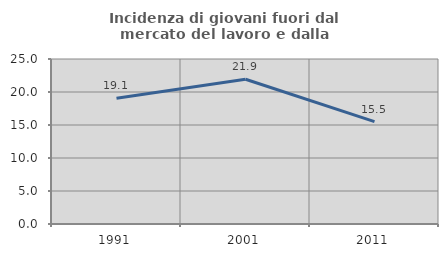
| Category | Incidenza di giovani fuori dal mercato del lavoro e dalla formazione  |
|---|---|
| 1991.0 | 19.066 |
| 2001.0 | 21.929 |
| 2011.0 | 15.508 |